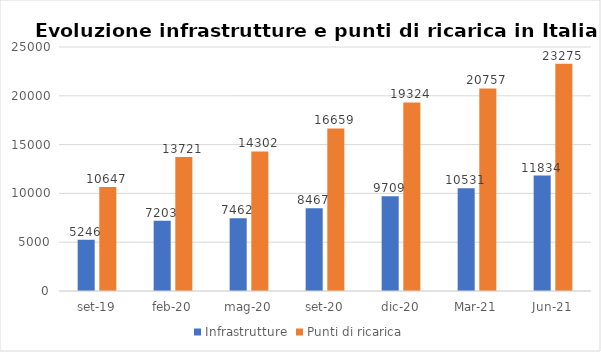
| Category | Infrastrutture | Punti di ricarica |
|---|---|---|
| set-19 | 5246 | 10647 |
| feb-20 | 7203 | 13721.4 |
| mag-20 | 7461.9 | 14301.691 |
| set-20 | 8466.645 | 16659.405 |
| dic-20 | 9708.75 | 19323.6 |
| mar-21 | 10531 | 20757 |
| giu-21 | 11834 | 23275 |